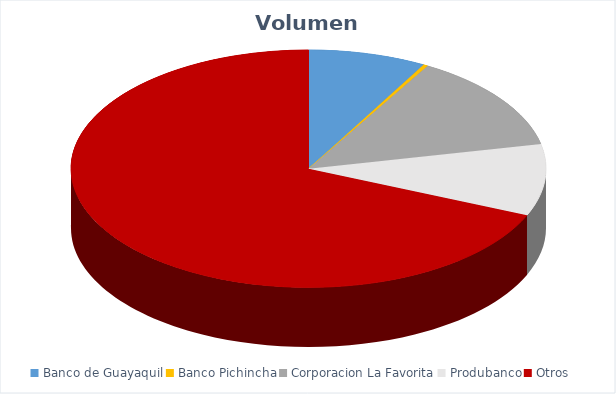
| Category | VOLUMEN ($USD) |
|---|---|
| Banco de Guayaquil | 14079.5 |
| Banco Pichincha | 540 |
| Corporacion La Favorita | 23281.7 |
| Produbanco | 17077.2 |
| Otros | 120000 |